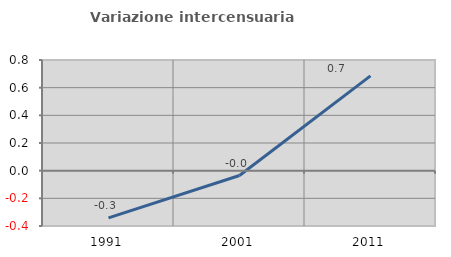
| Category | Variazione intercensuaria annua |
|---|---|
| 1991.0 | -0.341 |
| 2001.0 | -0.035 |
| 2011.0 | 0.686 |